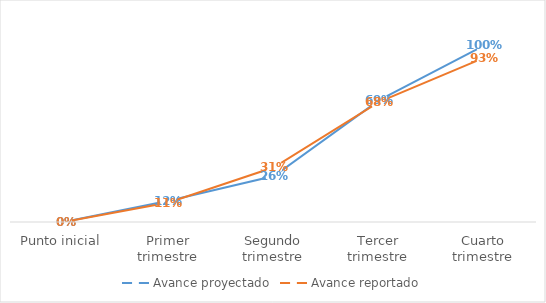
| Category | Avance proyectado | Avance reportado |
|---|---|---|
| Punto inicial | 0 | 0 |
| Primer trimestre | 0.12 | 0.11 |
| Segundo trimestre | 0.26 | 0.31 |
| Tercer trimestre | 0.69 | 0.68 |
| Cuarto trimestre | 1 | 0.93 |